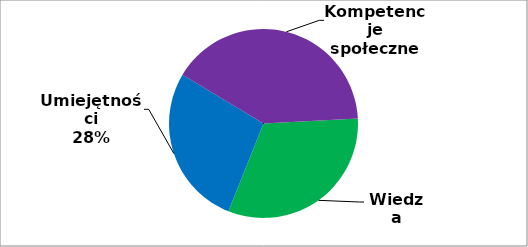
| Category | Series 0 |
|---|---|
| 0 | 81 |
| 1 | 70 |
| 2 | 103 |